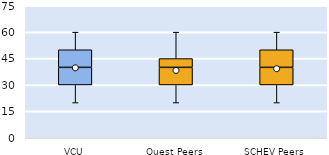
| Category | 25th | 50th | 75th |
|---|---|---|---|
| VCU | 30 | 10 | 10 |
| Quest Peers | 30 | 10 | 5 |
| SCHEV Peers | 30 | 10 | 10 |